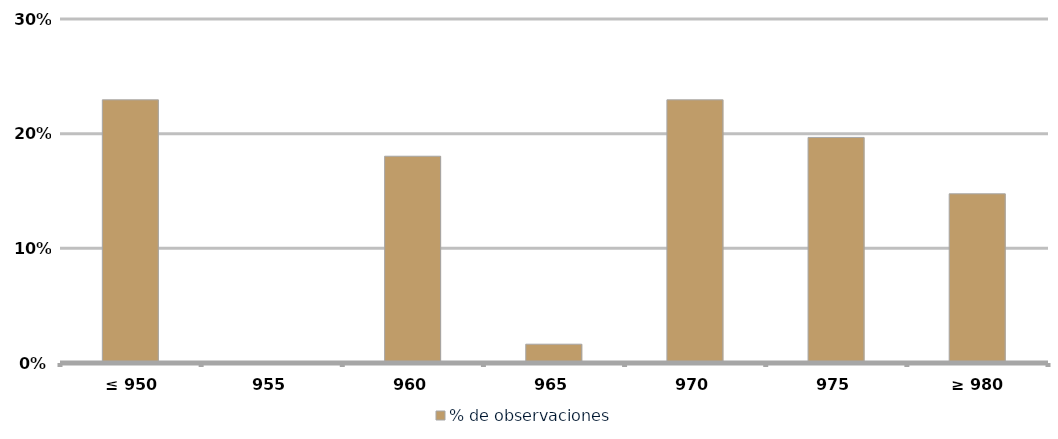
| Category | % de observaciones  |
|---|---|
|  ≤ 950  | 0.23 |
|  955  | 0 |
|  960  | 0.18 |
|  965  | 0.016 |
|  970  | 0.23 |
|  975  | 0.197 |
|  ≥ 980  | 0.148 |